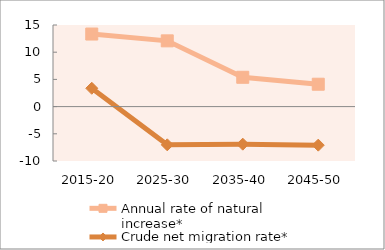
| Category | Annual rate of natural increase* | Crude net migration rate* |
|---|---|---|
| 2015-20 | 13.339 | 3.373 |
| 2025-30 | 12.087 | -7.027 |
| 2035-40 | 5.389 | -6.908 |
| 2045-50 | 4.112 | -7.09 |